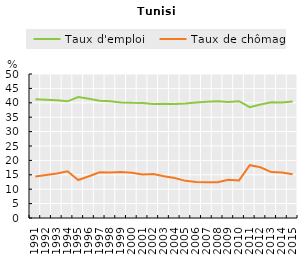
| Category | Taux d'emploi | Taux de chômage |
|---|---|---|
| 1991.0 | 41.274 | 14.437 |
| 1992.0 | 41.078 | 14.945 |
| 1993.0 | 40.857 | 15.47 |
| 1994.0 | 40.512 | 16.222 |
| 1995.0 | 41.994 | 13.178 |
| 1996.0 | 41.397 | 14.497 |
| 1997.0 | 40.749 | 15.9 |
| 1998.0 | 40.501 | 15.834 |
| 1999.0 | 40.133 | 16 |
| 2000.0 | 39.982 | 15.7 |
| 2001.0 | 39.972 | 15.1 |
| 2002.0 | 39.576 | 15.3 |
| 2003.0 | 39.644 | 14.5 |
| 2004.0 | 39.621 | 13.9 |
| 2005.0 | 39.789 | 12.9 |
| 2006.0 | 40.128 | 12.5 |
| 2007.0 | 40.353 | 12.4 |
| 2008.0 | 40.542 | 12.4 |
| 2009.0 | 40.307 | 13.29 |
| 2010.0 | 40.572 | 13.05 |
| 2011.0 | 38.459 | 18.33 |
| 2012.0 | 39.423 | 17.63 |
| 2013.0 | 40.163 | 15.934 |
| 2014.0 | 40.127 | 15.767 |
| 2015.0 | 40.448 | 15.155 |